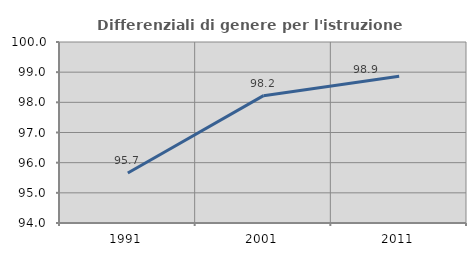
| Category | Differenziali di genere per l'istruzione superiore |
|---|---|
| 1991.0 | 95.655 |
| 2001.0 | 98.221 |
| 2011.0 | 98.862 |